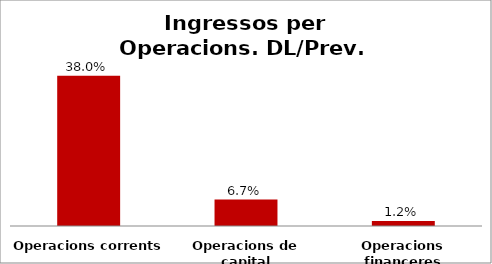
| Category | Series 0 |
|---|---|
| Operacions corrents | 0.38 |
| Operacions de capital | 0.067 |
| Operacions financeres | 0.012 |